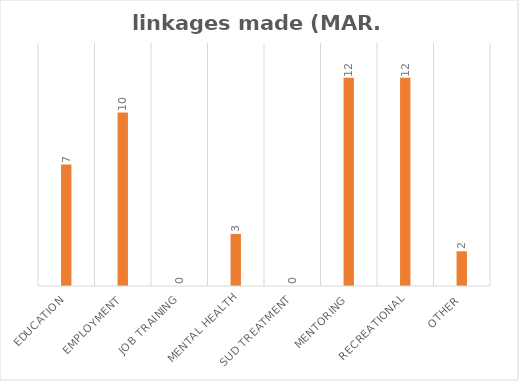
| Category | Series 0 |
|---|---|
| Education | 7 |
| Employment | 10 |
| Job Training | 0 |
| Mental Health | 3 |
| SUD Treatment | 0 |
| Mentoring | 12 |
| Recreational | 12 |
| Other | 2 |